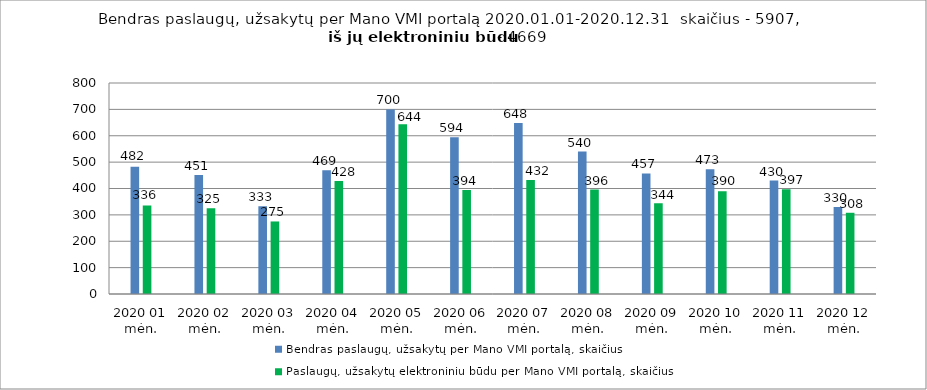
| Category | Bendras paslaugų, užsakytų per Mano VMI portalą, skaičius | Paslaugų, užsakytų elektroniniu būdu per Mano VMI portalą, skaičius |
|---|---|---|
| 2020 01 mėn. | 482 | 336 |
| 2020 02 mėn. | 451 | 325 |
| 2020 03 mėn. | 333 | 275 |
| 2020 04 mėn. | 469 | 428 |
| 2020 05 mėn. | 700 | 644 |
| 2020 06 mėn. | 594 | 394 |
| 2020 07 mėn. | 648 | 432 |
| 2020 08 mėn. | 540 | 396 |
| 2020 09 mėn. | 457 | 344 |
| 2020 10 mėn. | 473 | 390 |
| 2020 11 mėn. | 430 | 397 |
| 2020 12 mėn. | 330 | 308 |